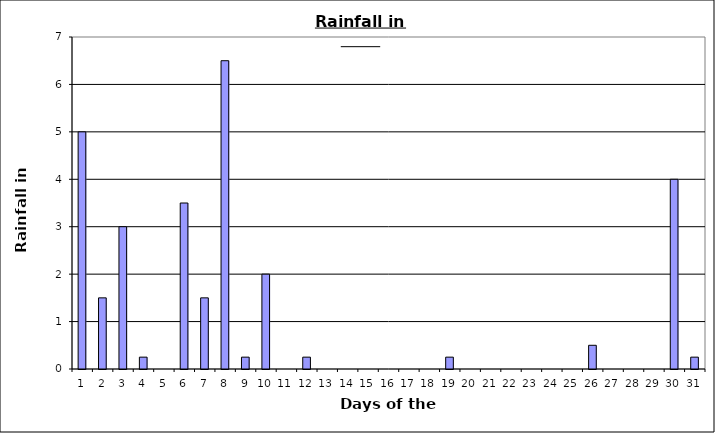
| Category | Series 0 |
|---|---|
| 0 | 5 |
| 1 | 1.5 |
| 2 | 3 |
| 3 | 0.25 |
| 4 | 0 |
| 5 | 3.5 |
| 6 | 1.5 |
| 7 | 6.5 |
| 8 | 0.25 |
| 9 | 2 |
| 10 | 0 |
| 11 | 0.25 |
| 12 | 0 |
| 13 | 0 |
| 14 | 0 |
| 15 | 0 |
| 16 | 0 |
| 17 | 0 |
| 18 | 0.25 |
| 19 | 0 |
| 20 | 0 |
| 21 | 0 |
| 22 | 0 |
| 23 | 0 |
| 24 | 0 |
| 25 | 0.5 |
| 26 | 0 |
| 27 | 0 |
| 28 | 0 |
| 29 | 4 |
| 30 | 0.25 |